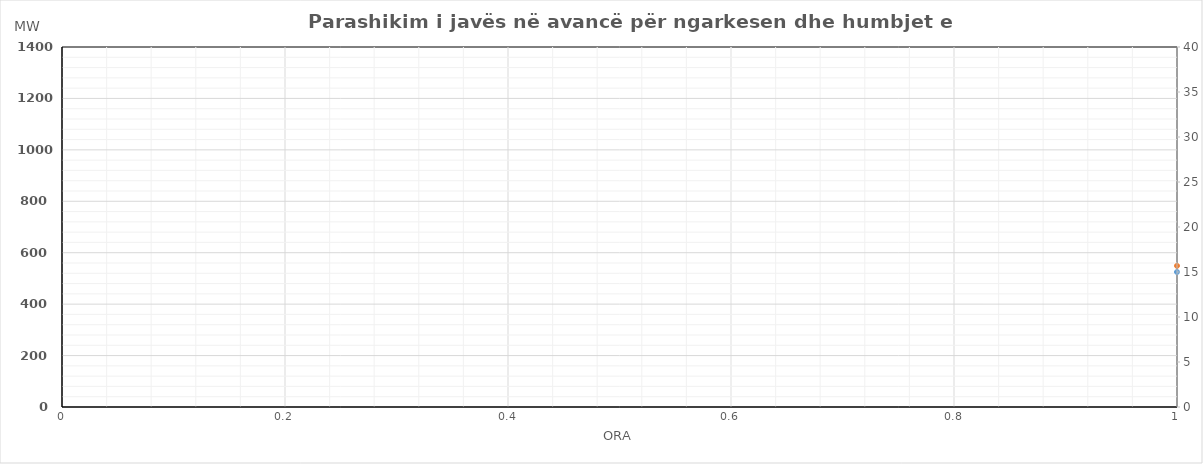
| Category | Ngarkesa (MWh) |
|---|---|
| 0 | 548.925 |
| 1 | 488.218 |
| 2 | 479.686 |
| 3 | 470.016 |
| 4 | 480.652 |
| 5 | 533.867 |
| 6 | 698.262 |
| 7 | 938.124 |
| 8 | 1008.061 |
| 9 | 983.246 |
| 10 | 962.253 |
| 11 | 953.654 |
| 12 | 930.081 |
| 13 | 942.019 |
| 14 | 960.661 |
| 15 | 970.853 |
| 16 | 987.2 |
| 17 | 1060.075 |
| 18 | 1140.781 |
| 19 | 1135.641 |
| 20 | 1100.555 |
| 21 | 1012.516 |
| 22 | 872.885 |
| 23 | 672.157 |
| 24 | 579.923 |
| 25 | 509.323 |
| 26 | 487.877 |
| 27 | 482.152 |
| 28 | 495.075 |
| 29 | 575.512 |
| 30 | 747.635 |
| 31 | 949.904 |
| 32 | 976.269 |
| 33 | 975.647 |
| 34 | 976.195 |
| 35 | 981.846 |
| 36 | 864.674 |
| 37 | 882.3 |
| 38 | 908.138 |
| 39 | 913.088 |
| 40 | 907.883 |
| 41 | 999.467 |
| 42 | 1130.142 |
| 43 | 1136.106 |
| 44 | 1101.001 |
| 45 | 1003.459 |
| 46 | 846.839 |
| 47 | 738.94 |
| 48 | 642.765 |
| 49 | 532.932 |
| 50 | 481.514 |
| 51 | 482.609 |
| 52 | 494.506 |
| 53 | 537.309 |
| 54 | 729.755 |
| 55 | 921.385 |
| 56 | 991.841 |
| 57 | 968.612 |
| 58 | 944.816 |
| 59 | 927.65 |
| 60 | 883.369 |
| 61 | 891.344 |
| 62 | 925.085 |
| 63 | 886.399 |
| 64 | 856.298 |
| 65 | 940.07 |
| 66 | 1019.536 |
| 67 | 1025.368 |
| 68 | 987.05 |
| 69 | 904.054 |
| 70 | 815.358 |
| 71 | 664.817 |
| 72 | 538.455 |
| 73 | 485.56 |
| 74 | 472.521 |
| 75 | 456.754 |
| 76 | 474.331 |
| 77 | 525.694 |
| 78 | 689.161 |
| 79 | 905.829 |
| 80 | 945.213 |
| 81 | 938.862 |
| 82 | 933.387 |
| 83 | 917.323 |
| 84 | 920.193 |
| 85 | 937.803 |
| 86 | 956.967 |
| 87 | 950.555 |
| 88 | 942.373 |
| 89 | 1007.592 |
| 90 | 1086.524 |
| 91 | 1073.265 |
| 92 | 1024.991 |
| 93 | 908.453 |
| 94 | 826.895 |
| 95 | 656.274 |
| 96 | 544.144 |
| 97 | 454.041 |
| 98 | 436.012 |
| 99 | 449.171 |
| 100 | 442.178 |
| 101 | 494.632 |
| 102 | 706.792 |
| 103 | 893.464 |
| 104 | 970.216 |
| 105 | 963.425 |
| 106 | 1002.355 |
| 107 | 991.117 |
| 108 | 1007.036 |
| 109 | 1011.566 |
| 110 | 1004.683 |
| 111 | 1004.767 |
| 112 | 1021.069 |
| 113 | 1050.118 |
| 114 | 1149.239 |
| 115 | 1224.122 |
| 116 | 1222.872 |
| 117 | 1125.202 |
| 118 | 891.671 |
| 119 | 940.826 |
| 120 | 825.564 |
| 121 | 713.782 |
| 122 | 755.745 |
| 123 | 732.768 |
| 124 | 764.231 |
| 125 | 767.049 |
| 126 | 842.523 |
| 127 | 1032.125 |
| 128 | 960.145 |
| 129 | 937.419 |
| 130 | 945.557 |
| 131 | 958.946 |
| 132 | 965.784 |
| 133 | 926.353 |
| 134 | 944.809 |
| 135 | 998.689 |
| 136 | 985.577 |
| 137 | 1072.857 |
| 138 | 1150.941 |
| 139 | 1079.365 |
| 140 | 1002.147 |
| 141 | 934.378 |
| 142 | 806.521 |
| 143 | 734.644 |
| 144 | 708.479 |
| 145 | 621.146 |
| 146 | 589.549 |
| 147 | 579.133 |
| 148 | 599.311 |
| 149 | 572.092 |
| 150 | 638.356 |
| 151 | 720.561 |
| 152 | 787.64 |
| 153 | 817.954 |
| 154 | 865.921 |
| 155 | 825.41 |
| 156 | 844.294 |
| 157 | 887.731 |
| 158 | 845.057 |
| 159 | 811.906 |
| 160 | 796.966 |
| 161 | 916.897 |
| 162 | 1036.076 |
| 163 | 1065.78 |
| 164 | 1045.434 |
| 165 | 978.923 |
| 166 | 816.348 |
| 167 | 613.218 |